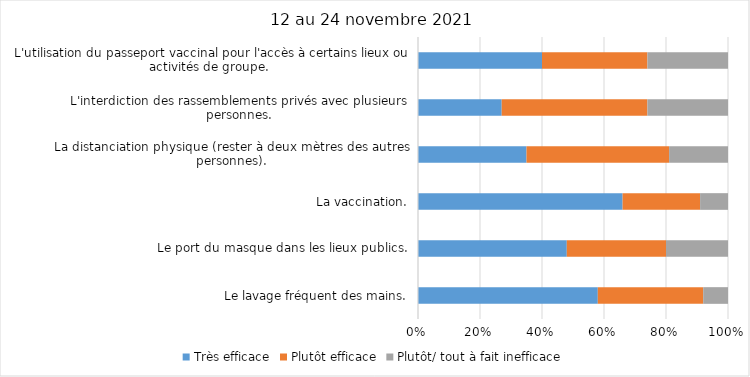
| Category | Très efficace | Plutôt efficace | Plutôt/ tout à fait inefficace |
|---|---|---|---|
| Le lavage fréquent des mains. | 58 | 34 | 8 |
| Le port du masque dans les lieux publics. | 48 | 32 | 20 |
| La vaccination. | 66 | 25 | 9 |
| La distanciation physique (rester à deux mètres des autres personnes). | 35 | 46 | 19 |
| L'interdiction des rassemblements privés avec plusieurs personnes. | 27 | 47 | 26 |
| L'utilisation du passeport vaccinal pour l'accès à certains lieux ou activités de groupe.  | 40 | 34 | 26 |